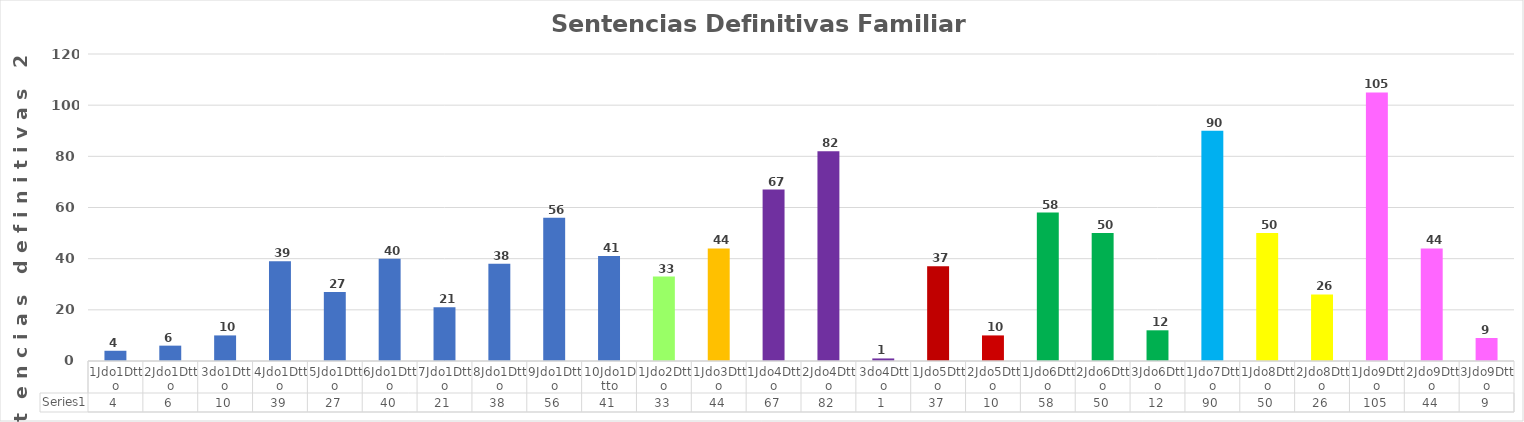
| Category | Series 0 |
|---|---|
| 1Jdo1Dtto | 4 |
| 2Jdo1Dtto | 6 |
| 3do1Dtto | 10 |
| 4Jdo1Dtto | 39 |
| 5Jdo1Dtto | 27 |
| 6Jdo1Dtto | 40 |
| 7Jdo1Dtto | 21 |
| 8Jdo1Dtto | 38 |
| 9Jdo1Dtto | 56 |
| 10Jdo1Dtto | 41 |
| 1Jdo2Dtto | 33 |
| 1Jdo3Dtto | 44 |
| 1Jdo4Dtto | 67 |
| 2Jdo4Dtto | 82 |
| 3do4Dtto | 1 |
| 1Jdo5Dtto | 37 |
| 2Jdo5Dtto | 10 |
| 1Jdo6Dtto | 58 |
| 2Jdo6Dtto | 50 |
| 3Jdo6Dtto | 12 |
| 1Jdo7Dtto | 90 |
| 1Jdo8Dtto | 50 |
| 2Jdo8Dtto | 26 |
| 1Jdo9Dtto | 105 |
| 2Jdo9Dtto | 44 |
| 3Jdo9Dtto | 9 |